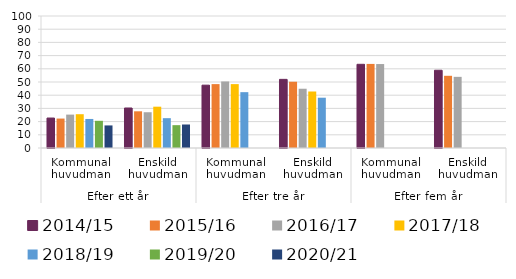
| Category | 2014/15 | 2015/16 | 2016/17 | 2017/18 | 2018/19 | 2019/20 | 2020/21 |
|---|---|---|---|---|---|---|---|
| 0 | 22.7 | 22.3 | 25.3 | 25.6 | 22 | 20.6 | 17.1 |
| 1 | 30.3 | 27.8 | 27.1 | 31.3 | 22.6 | 17.3 | 17.8 |
| 2 | 47.6 | 48.4 | 50.4 | 48.4 | 42.3 | 0 | 0 |
| 3 | 52 | 50.2 | 44.9 | 42.8 | 38.1 | 0 | 0 |
| 4 | 63.4 | 63.7 | 63.6 | 0 | 0 | 0 | 0 |
| 5 | 58.9 | 54.7 | 53.9 | 0 | 0 | 0 | 0 |